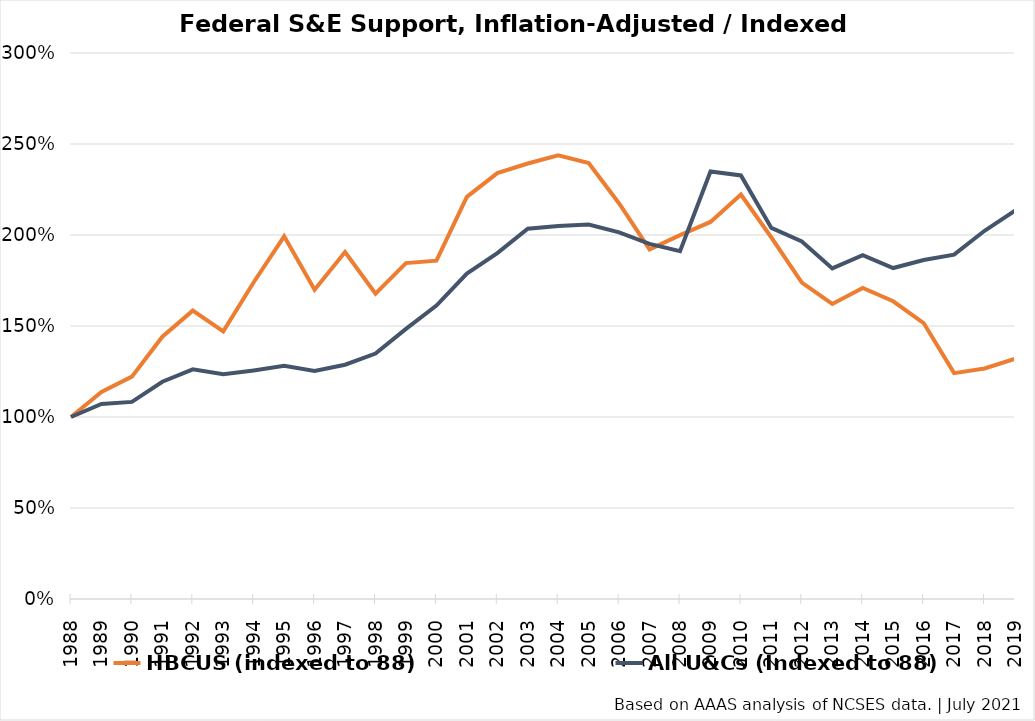
| Category | HBCUS (indexed to 88) | All U&Cs (Indexed to 88) |
|---|---|---|
| 1988 | 1 | 1 |
| 1989 | 1.137 | 1.072 |
| 1990 | 1.222 | 1.083 |
| 1991 | 1.441 | 1.194 |
| 1992 | 1.585 | 1.262 |
| 1993 | 1.471 | 1.235 |
| 1994 | 1.74 | 1.256 |
| 1995 | 1.993 | 1.281 |
| 1996 | 1.7 | 1.253 |
| 1997 | 1.907 | 1.287 |
| 1998 | 1.677 | 1.348 |
| 1999 | 1.845 | 1.484 |
| 2000 | 1.859 | 1.612 |
| 2001 | 2.21 | 1.788 |
| 2002 | 2.34 | 1.901 |
| 2003 | 2.393 | 2.035 |
| 2004 | 2.438 | 2.05 |
| 2005 | 2.396 | 2.057 |
| 2006 | 2.173 | 2.014 |
| 2007 | 1.921 | 1.951 |
| 2008 | 1.999 | 1.911 |
| 2009 | 2.072 | 2.349 |
| 2010 | 2.223 | 2.327 |
| 2011 | 1.986 | 2.039 |
| 2012 | 1.739 | 1.965 |
| 2013 | 1.621 | 1.816 |
| 2014 | 1.709 | 1.89 |
| 2015 | 1.636 | 1.819 |
| 2016 | 1.516 | 1.862 |
| 2017 | 1.241 | 1.892 |
| 2018 | 1.267 | 2.023 |
| 2019 | 1.319 | 2.133 |